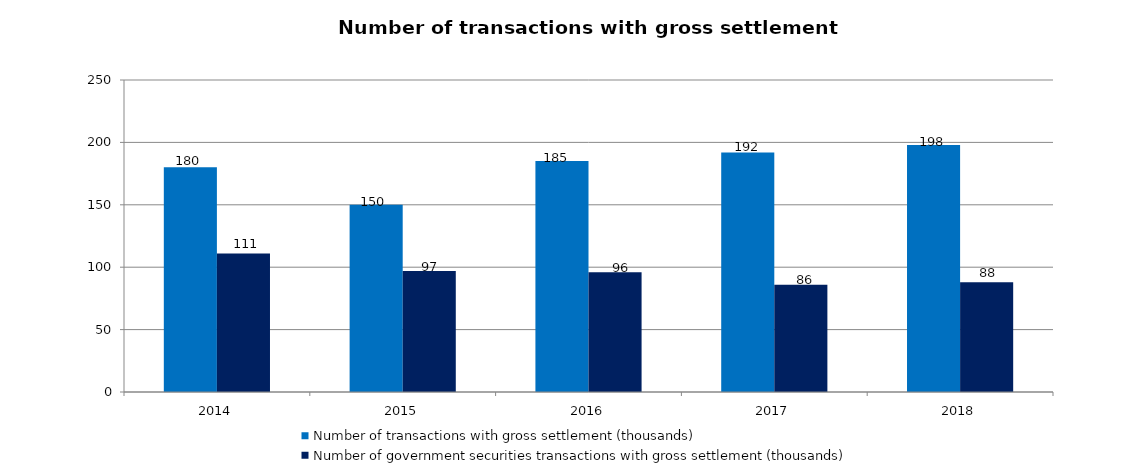
| Category | Number of transactions with gross settlement (thousands) | Number of government securities transactions with gross settlement (thousands) |
|---|---|---|
| 2014.0 | 180 | 111 |
| 2015.0 | 150 | 97 |
| 2016.0 | 185 | 96 |
| 2017.0 | 192 | 86 |
| 2018.0 | 198 | 88 |